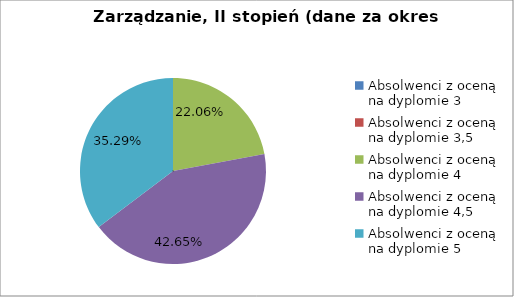
| Category | Series 0 |
|---|---|
| Absolwenci z oceną na dyplomie 3 | 0 |
| Absolwenci z oceną na dyplomie 3,5 | 0 |
| Absolwenci z oceną na dyplomie 4 | 22.059 |
| Absolwenci z oceną na dyplomie 4,5 | 42.647 |
| Absolwenci z oceną na dyplomie 5 | 35.294 |